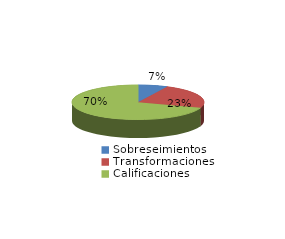
| Category | Series 0 |
|---|---|
| Sobreseimientos | 41 |
| Transformaciones | 130 |
| Calificaciones | 394 |